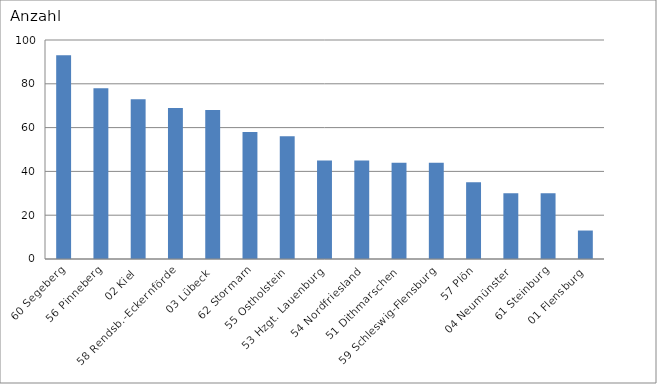
| Category | 60 Segeberg 56 Pinneberg 02 Kiel 58 Rendsb.-Eckernförde 03 Lübeck 62 Stormarn 55 Ostholstein 53 Hzgt. Lauenburg 54 Nordfriesland 51 Dithmarschen 59 Schleswig-Flensburg 57 Plön 04 Neumünster 61 Steinburg 01 Flensburg |
|---|---|
| 60 Segeberg | 93 |
| 56 Pinneberg | 78 |
| 02 Kiel | 73 |
| 58 Rendsb.-Eckernförde | 69 |
| 03 Lübeck | 68 |
| 62 Stormarn | 58 |
| 55 Ostholstein | 56 |
| 53 Hzgt. Lauenburg | 45 |
| 54 Nordfriesland | 45 |
| 51 Dithmarschen | 44 |
| 59 Schleswig-Flensburg | 44 |
| 57 Plön | 35 |
| 04 Neumünster | 30 |
| 61 Steinburg | 30 |
| 01 Flensburg | 13 |